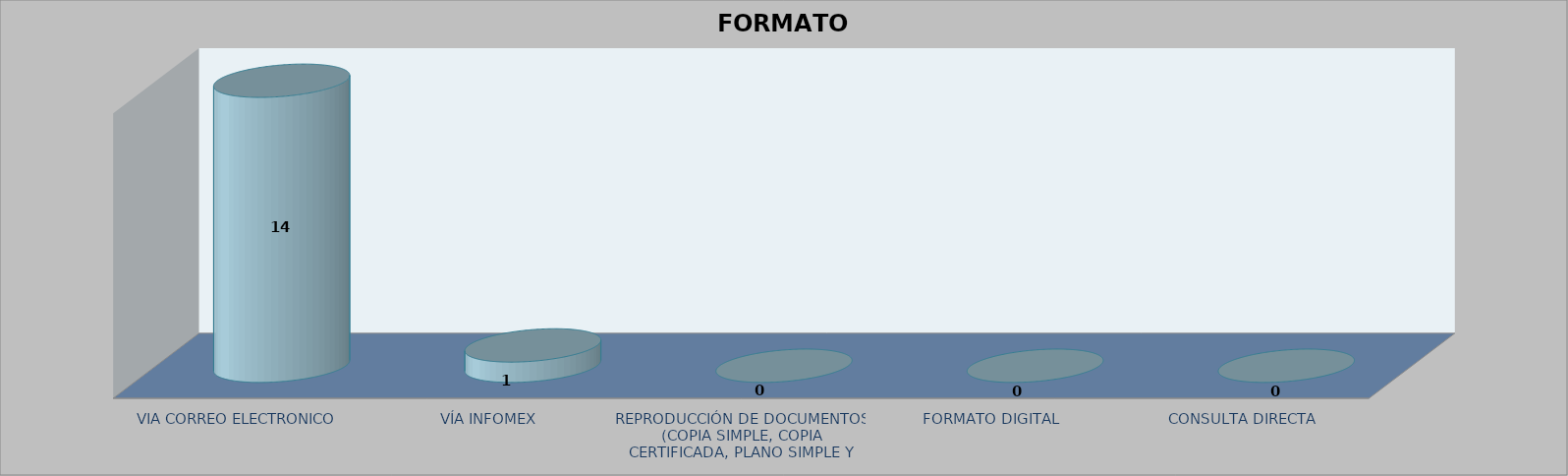
| Category |        FORMATO SOLICITADO | Series 1 | Series 2 |
|---|---|---|---|
| VIA CORREO ELECTRONICO |  |  | 14 |
| VÍA INFOMEX |  |  | 1 |
| REPRODUCCIÓN DE DOCUMENTOS (COPIA SIMPLE, COPIA CERTIFICADA, PLANO SIMPLE Y PLANO CERTIFICADO) |  |  | 0 |
| FORMATO DIGITAL |  |  | 0 |
| CONSULTA DIRECTA |  |  | 0 |